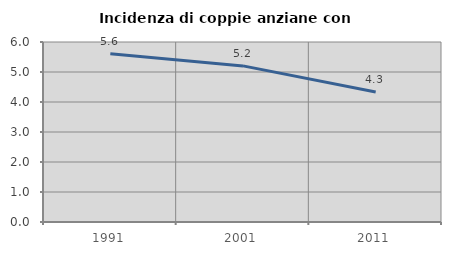
| Category | Incidenza di coppie anziane con figli |
|---|---|
| 1991.0 | 5.61 |
| 2001.0 | 5.204 |
| 2011.0 | 4.333 |